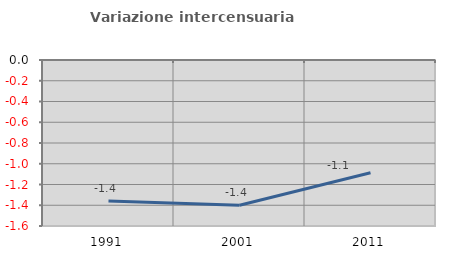
| Category | Variazione intercensuaria annua |
|---|---|
| 1991.0 | -1.359 |
| 2001.0 | -1.401 |
| 2011.0 | -1.086 |